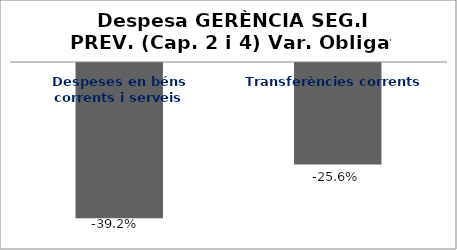
| Category | Series 0 |
|---|---|
| Despeses en béns corrents i serveis | -0.392 |
| Transferències corrents | -0.256 |